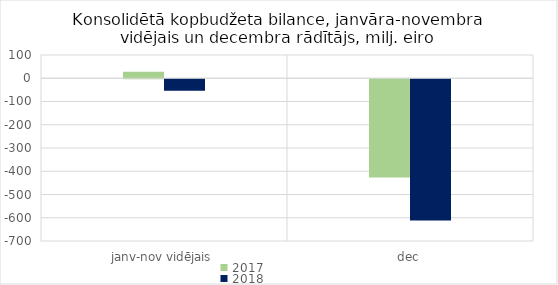
| Category | 2017 | 2018 |
|---|---|---|
| janv-nov vidējais | 27711.275 | -49209.011 |
| dec | -422440.005 | -607594.717 |